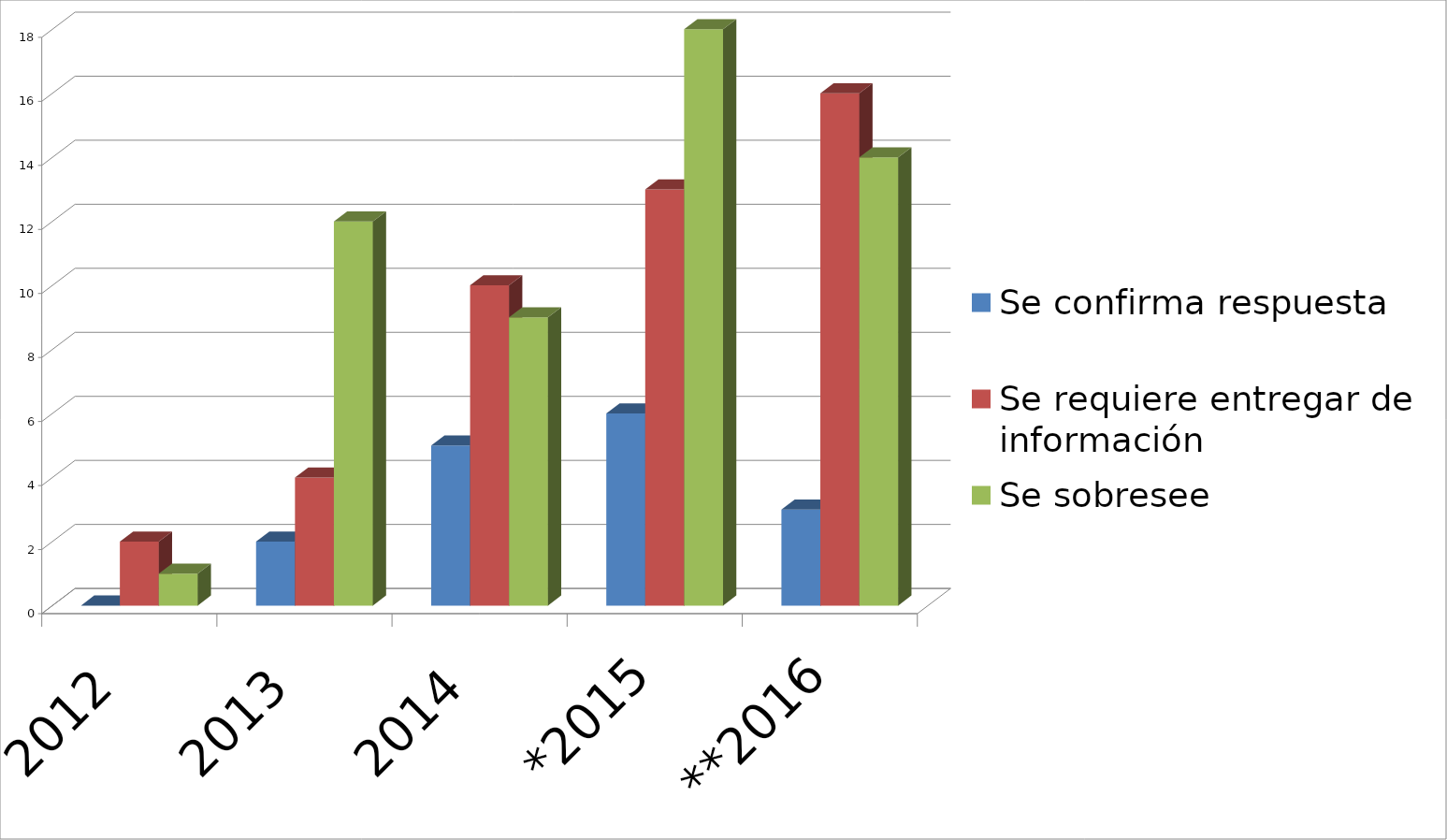
| Category | Se confirma respuesta | Se requiere entregar de información  | Se sobresee  |
|---|---|---|---|
| 2012 | 0 | 2 | 1 |
| 2013 | 2 | 4 | 12 |
| 2014 | 5 | 10 | 9 |
| *2015 | 6 | 13 | 18 |
| **2016 | 3 | 16 | 14 |